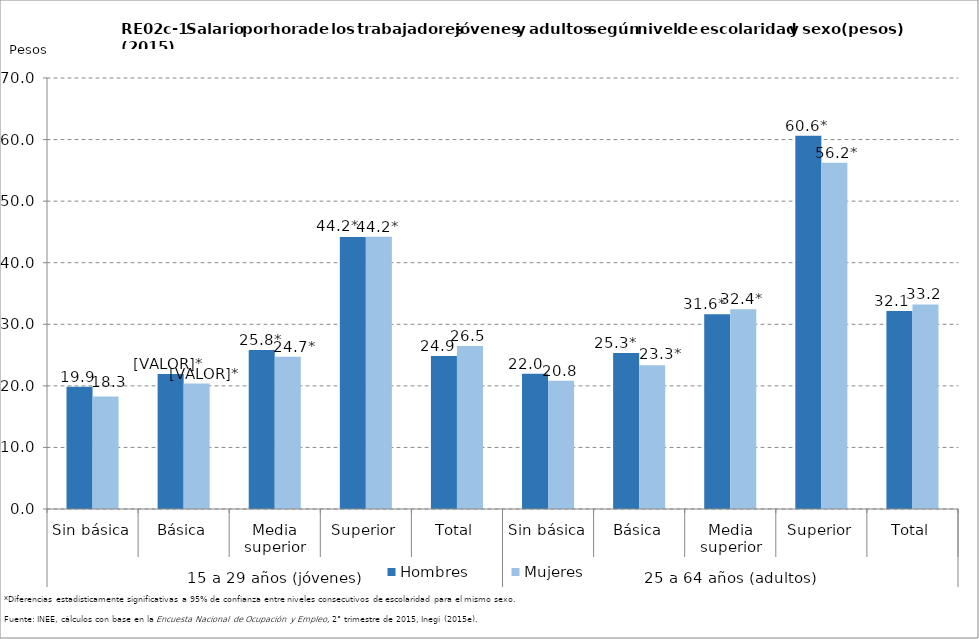
| Category | Hombres | Mujeres |
|---|---|---|
| 0 | 19.862 | 18.254 |
| 1 | 21.923 | 20.371 |
| 2 | 25.803 | 24.742 |
| 3 | 44.193 | 44.231 |
| 4 | 24.851 | 26.486 |
| 5 | 21.98 | 20.836 |
| 6 | 25.329 | 23.345 |
| 7 | 31.635 | 32.434 |
| 8 | 60.625 | 56.232 |
| 9 | 32.15 | 33.231 |